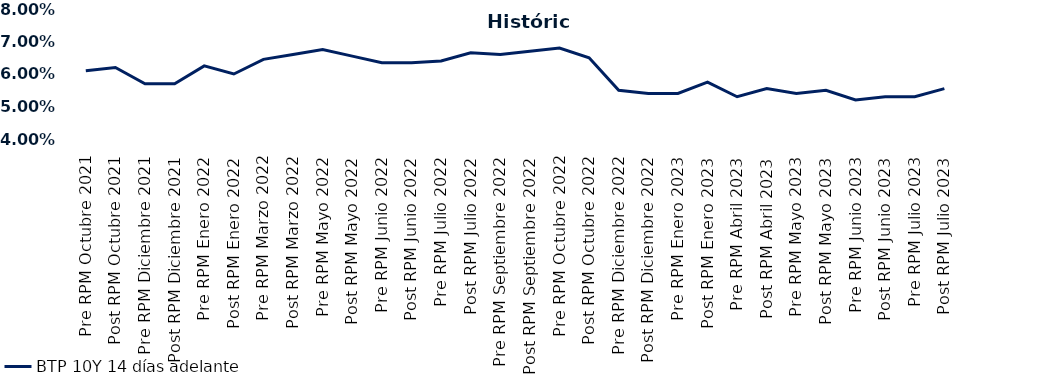
| Category | BTP 10Y 14 días adelante |
|---|---|
| Pre RPM Octubre 2021 | 0.061 |
| Post RPM Octubre 2021 | 0.062 |
| Pre RPM Diciembre 2021 | 0.057 |
| Post RPM Diciembre 2021 | 0.057 |
| Pre RPM Enero 2022 | 0.062 |
| Post RPM Enero 2022 | 0.06 |
| Pre RPM Marzo 2022 | 0.064 |
| Post RPM Marzo 2022 | 0.066 |
| Pre RPM Mayo 2022 | 0.068 |
| Post RPM Mayo 2022 | 0.066 |
| Pre RPM Junio 2022 | 0.064 |
| Post RPM Junio 2022 | 0.064 |
| Pre RPM Julio 2022 | 0.064 |
| Post RPM Julio 2022 | 0.066 |
| Pre RPM Septiembre 2022 | 0.066 |
| Post RPM Septiembre 2022 | 0.067 |
| Pre RPM Octubre 2022 | 0.068 |
| Post RPM Octubre 2022 | 0.065 |
| Pre RPM Diciembre 2022 | 0.055 |
| Post RPM Diciembre 2022 | 0.054 |
| Pre RPM Enero 2023 | 0.054 |
| Post RPM Enero 2023 | 0.058 |
| Pre RPM Abril 2023 | 0.053 |
| Post RPM Abril 2023 | 0.056 |
| Pre RPM Mayo 2023 | 0.054 |
| Post RPM Mayo 2023 | 0.055 |
| Pre RPM Junio 2023 | 0.052 |
| Post RPM Junio 2023 | 0.053 |
| Pre RPM Julio 2023 | 0.053 |
| Post RPM Julio 2023 | 0.056 |